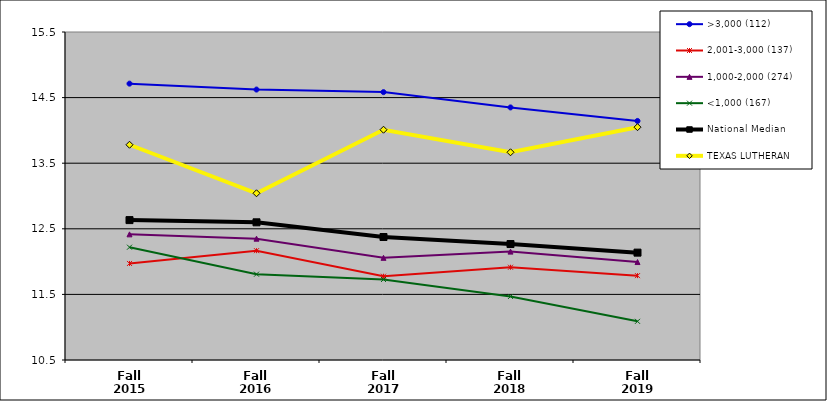
| Category | >3,000 (112) | 2,001-3,000 (137) | 1,000-2,000 (274) | <1,000 (167) | National Median | TEXAS LUTHERAN |
|---|---|---|---|---|---|---|
| Fall 2015 | 14.713 | 11.972 | 12.415 | 12.22 | 12.633 | 13.781 |
| Fall 2016 | 14.623 | 12.167 | 12.349 | 11.808 | 12.599 | 13.042 |
| Fall 2017 | 14.584 | 11.777 | 12.058 | 11.727 | 12.375 | 14.01 |
| Fall 2018 | 14.35 | 11.914 | 12.152 | 11.469 | 12.268 | 13.667 |
| Fall 2019 | 14.144 | 11.786 | 11.993 | 11.09 | 12.137 | 14.049 |